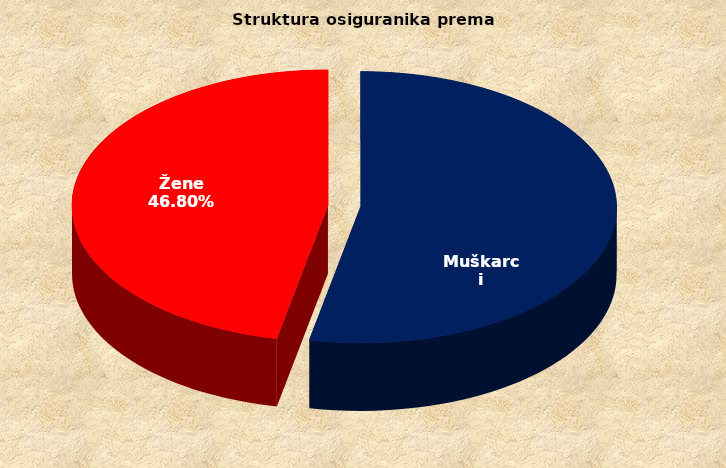
| Category | Series 0 |
|---|---|
| Muškarci | 877174 |
| Žene | 771703 |